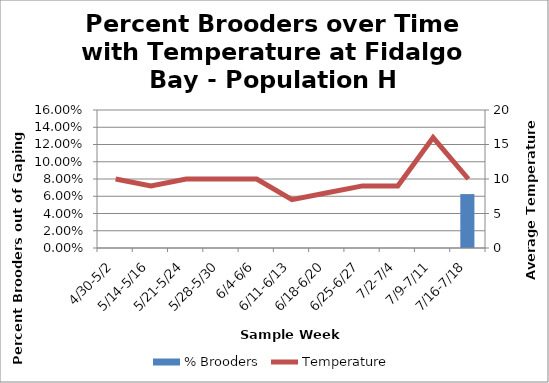
| Category | % Brooders |
|---|---|
| 4/30-5/2 | 0 |
| 5/14-5/16 | 0 |
| 5/21-5/24 | 0 |
| 5/28-5/30 | 0 |
| 6/4-6/6 | 0 |
| 6/11-6/13 | 0 |
| 6/18-6/20 | 0 |
| 6/25-6/27 | 0 |
| 7/2-7/4 | 0 |
| 7/9-7/11 | 0 |
| 7/16-7/18 | 0.062 |